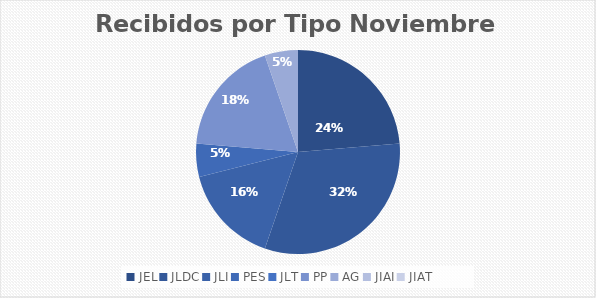
| Category | Series 0 |
|---|---|
| JEL | 9 |
| JLDC | 12 |
| JLI | 6 |
| PES | 2 |
| JLT | 0 |
| PP | 7 |
| AG | 2 |
| JIAI | 0 |
| JIAT | 0 |